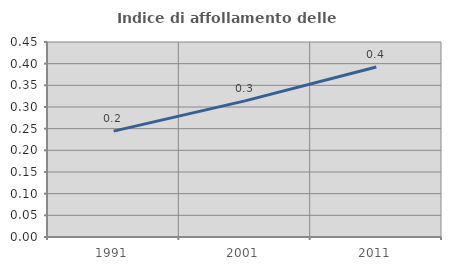
| Category | Indice di affollamento delle abitazioni  |
|---|---|
| 1991.0 | 0.244 |
| 2001.0 | 0.314 |
| 2011.0 | 0.392 |